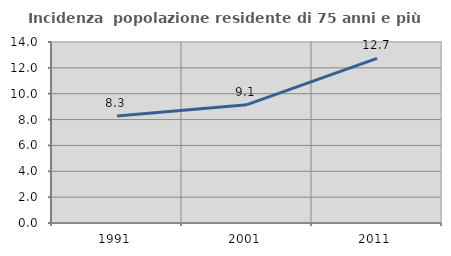
| Category | Incidenza  popolazione residente di 75 anni e più |
|---|---|
| 1991.0 | 8.28 |
| 2001.0 | 9.15 |
| 2011.0 | 12.729 |